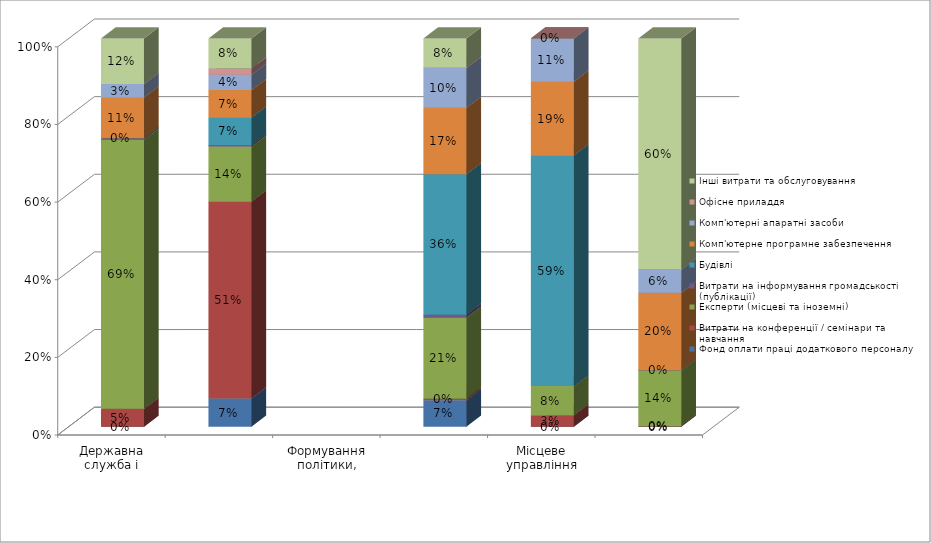
| Category | Фонд оплати праці додаткового персоналу | Витрати на конференції / семінари та навчання | Експерти (місцеві та іноземні) | Витрати на інформування громадськості (публікації)    | Будівлі | Комп'ютерне програмне забезпечення | Комп'ютерні апаратні засоби | Офісне приладдя | Інші витрати та обслуговування |
|---|---|---|---|---|---|---|---|---|---|
| Державна служба і людські ресурси | 0 | 0.046 | 0.693 | 0.003 | 0 | 0.105 | 0.034 | 0 | 0.118 |
| Албанська школа державного управління | 0.073 | 0.507 | 0.142 | 0.004 | 0.071 | 0.071 | 0.039 | 0.016 | 0.077 |
| Формування політики, законодавство і контроль | 0 | 0 | 0 | 0 | 0 | 0 | 0 | 0 | 0 |
| Інновації | 0.068 | 0.004 | 0.209 | 0.008 | 0.362 | 0.171 | 0.102 | 0.001 | 0.075 |
| Місцеве управління | 0 | 0.029 | 0.075 | 0 | 0.594 | 0.19 | 0.111 | 0 | 0 |
| Прозорість і боротьба з корупцією  | 0 | 0.001 | 0.144 | 0 | 0 | 0.2 | 0.059 | 0 | 0.595 |